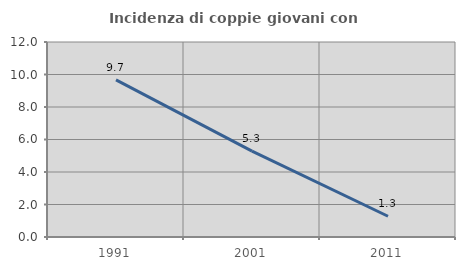
| Category | Incidenza di coppie giovani con figli |
|---|---|
| 1991.0 | 9.669 |
| 2001.0 | 5.281 |
| 2011.0 | 1.277 |